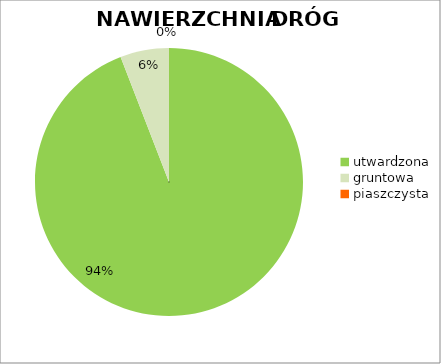
| Category | Series 0 |
|---|---|
| utwardzona | 0.941 |
| gruntowa | 0.059 |
| piaszczysta | 0 |